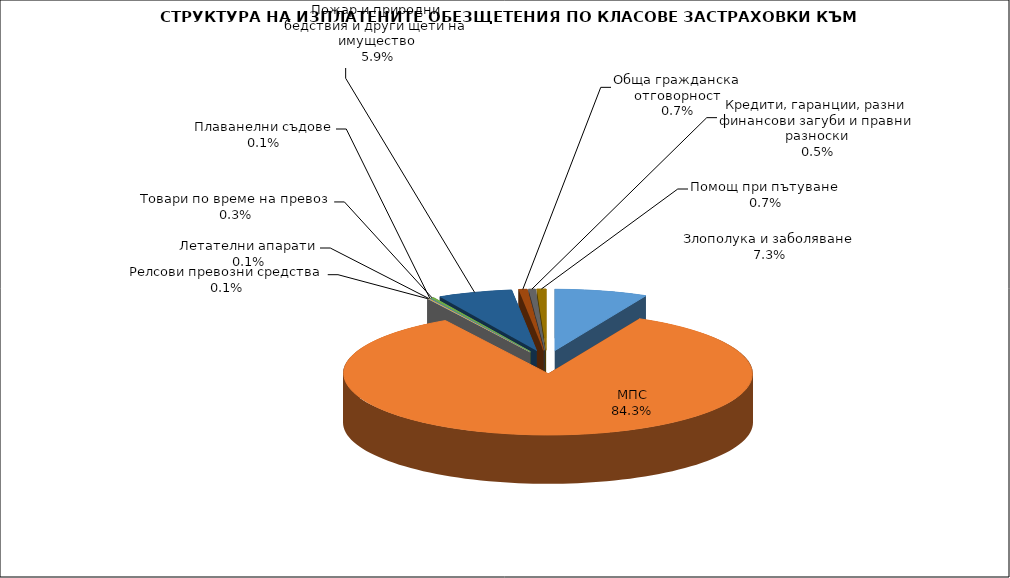
| Category | Злополука и заболяване |
|---|---|
| Злополука и заболяване | 0.073 |
| МПС | 0.843 |
| Релсови превозни средства | 0.001 |
| Летателни апарати | 0.001 |
| Плаванелни съдове | 0.001 |
| Товари по време на превоз | 0.003 |
| Пожар и природни бедствия и други щети на имущество | 0.059 |
| Обща гражданска отговорност | 0.007 |
| Кредити, гаранции, разни финансови загуби и правни разноски | 0.005 |
| Помощ при пътуване | 0.007 |